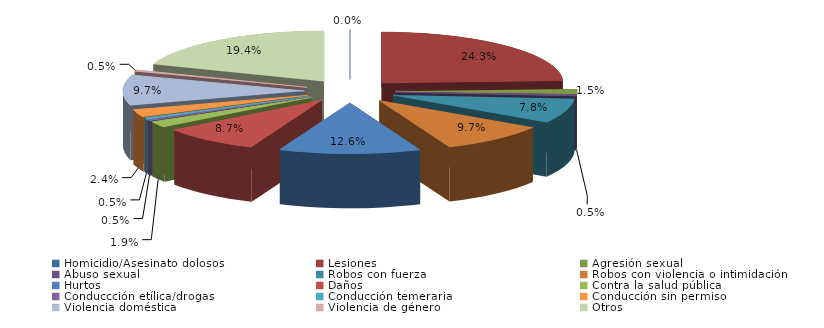
| Category | Series 0 |
|---|---|
| Homicidio/Asesinato dolosos | 0 |
| Lesiones | 50 |
| Agresión sexual | 3 |
| Abuso sexual | 1 |
| Robos con fuerza | 16 |
| Robos con violencia o intimidación | 20 |
| Hurtos | 26 |
| Daños | 18 |
| Contra la salud pública | 4 |
| Conduccción etílica/drogas | 1 |
| Conducción temeraria | 1 |
| Conducción sin permiso | 5 |
| Violencia doméstica | 20 |
| Violencia de género | 1 |
| Otros | 40 |